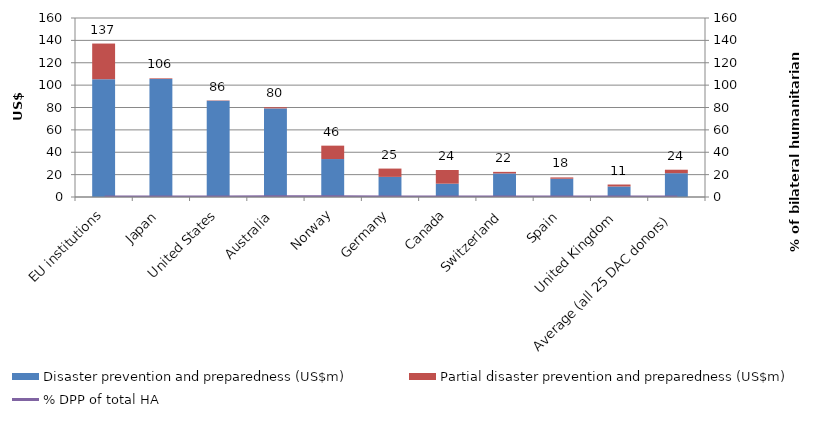
| Category | Disaster prevention and preparedness (US$m) | Partial disaster prevention and preparedness (US$m) |
|---|---|---|
| EU institutions | 105.296 | 31.87 |
| Japan | 105.585 | 0.56 |
| United States | 85.934 | 0.305 |
| Australia | 79.215 | 1.005 |
| Norway | 33.927 | 11.974 |
| Germany | 17.984 | 7.422 |
| Canada | 11.913 | 12.23 |
| Switzerland | 21.069 | 1.403 |
| Spain | 16.323 | 1.182 |
| United Kingdom | 9.39 | 1.77 |
| Average (all 25 DAC donors) | 21.279 | 3.095 |